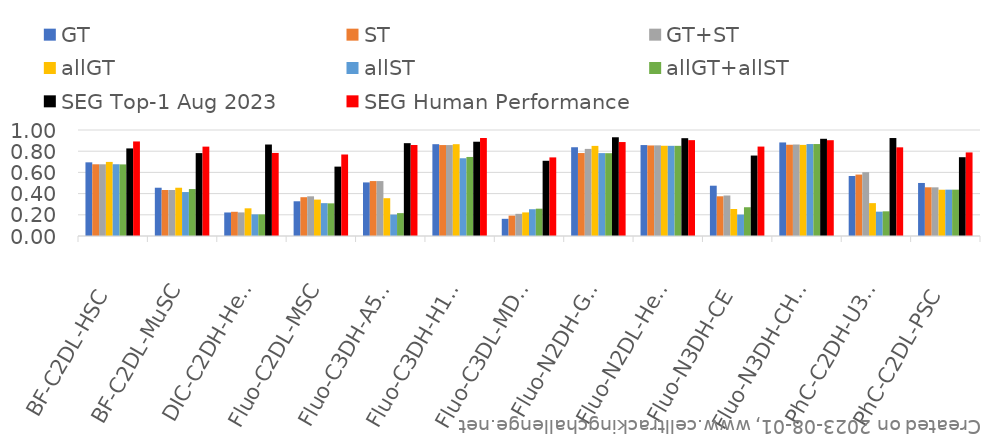
| Category | GT | ST | GT+ST | allGT | allST | allGT+allST | SEG Top-1 Aug 2023 | SEG Human Performance |
|---|---|---|---|---|---|---|---|---|
| BF-C2DL-HSC | 0.695 | 0.677 | 0.677 | 0.699 | 0.677 | 0.675 | 0.826 | 0.892 |
| BF-C2DL-MuSC | 0.455 | 0.434 | 0.434 | 0.455 | 0.415 | 0.443 | 0.782 | 0.843 |
| DIC-C2DH-HeLa | 0.222 | 0.228 | 0.223 | 0.261 | 0.204 | 0.204 | 0.863 | 0.784 |
| Fluo-C2DL-MSC | 0.328 | 0.366 | 0.374 | 0.344 | 0.31 | 0.308 | 0.655 | 0.769 |
| Fluo-C3DH-A549 | 0.505 | 0.518 | 0.518 | 0.357 | 0.202 | 0.216 | 0.876 | 0.859 |
| Fluo-C3DH-H157 | 0.866 | 0.858 | 0.858 | 0.866 | 0.734 | 0.746 | 0.889 | 0.924 |
| Fluo-C3DL-MDA231 | 0.162 | 0.192 | 0.209 | 0.222 | 0.253 | 0.258 | 0.71 | 0.742 |
| Fluo-N2DH-GOWT1 | 0.837 | 0.783 | 0.822 | 0.85 | 0.782 | 0.781 | 0.931 | 0.886 |
| Fluo-N2DL-HeLa | 0.858 | 0.854 | 0.855 | 0.851 | 0.851 | 0.851 | 0.923 | 0.904 |
| Fluo-N3DH-CE | 0.474 | 0.375 | 0.382 | 0.255 | 0.202 | 0.271 | 0.759 | 0.844 |
| Fluo-N3DH-CHO | 0.883 | 0.861 | 0.863 | 0.859 | 0.867 | 0.868 | 0.917 | 0.904 |
| PhC-C2DH-U373 | 0.566 | 0.579 | 0.602 | 0.31 | 0.229 | 0.233 | 0.924 | 0.836 |
| PhC-C2DL-PSC | 0.5 | 0.459 | 0.459 | 0.436 | 0.437 | 0.437 | 0.743 | 0.788 |